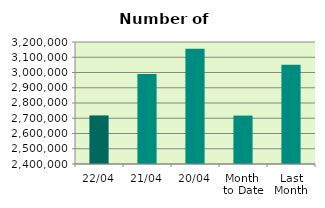
| Category | Series 0 |
|---|---|
| 22/04 | 2718476 |
| 21/04 | 2989624 |
| 20/04 | 3154988 |
| Month 
to Date | 2717542.143 |
| Last
Month | 3050763.217 |